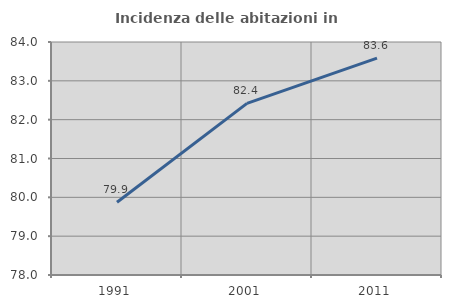
| Category | Incidenza delle abitazioni in proprietà  |
|---|---|
| 1991.0 | 79.874 |
| 2001.0 | 82.42 |
| 2011.0 | 83.584 |